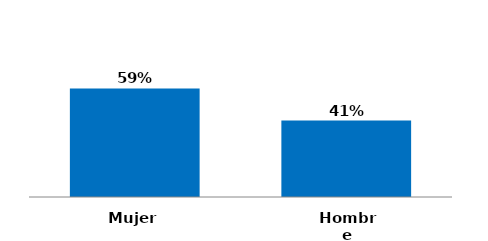
| Category | Series 0 |
|---|---|
| Hombre | 0.413 |
| Mujer | 0.587 |